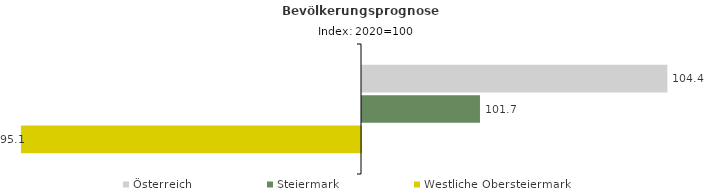
| Category | Österreich | Steiermark | Westliche Obersteiermark |
|---|---|---|---|
| 2020.0 | 104.4 | 101.7 | 95.1 |